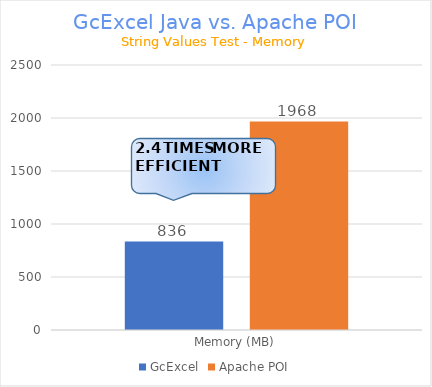
| Category | GcExcel | Apache POI |
|---|---|---|
| Memory (MB) | 835.875 | 1967.56 |